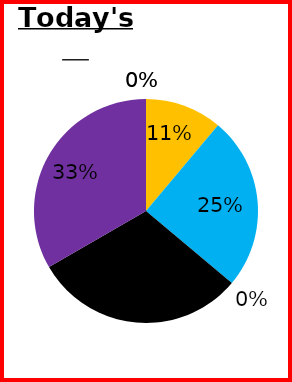
| Category | Time |
|---|---|
| Study | 0 |
| Study2 | 0 |
| Sleep | 0.111 |
| School | 0.25 |
| Free1 | 0 |
| Free2 | 0.306 |
| Free3 | 0.333 |